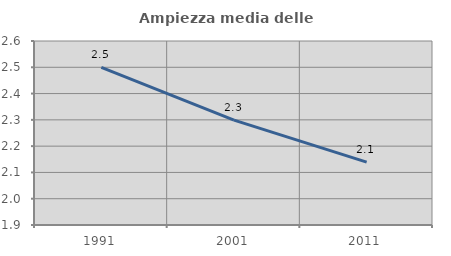
| Category | Ampiezza media delle famiglie |
|---|---|
| 1991.0 | 2.5 |
| 2001.0 | 2.299 |
| 2011.0 | 2.139 |